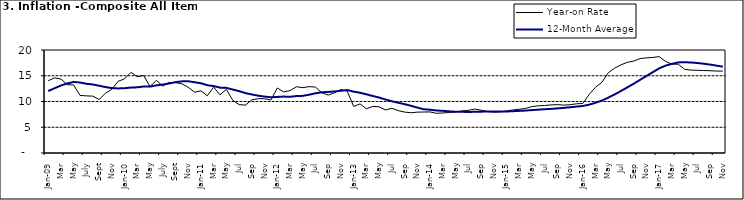
| Category | Year-on Rate | 12-Month Average |
|---|---|---|
| Jan-09 | 14.034 | 12.032 |
| Feb | 14.584 | 12.567 |
| Mar | 14.366 | 13.101 |
| Apr | 13.268 | 13.51 |
| May | 13.212 | 13.787 |
| June | 11.194 | 13.694 |
| July | 11.09 | 13.437 |
| Aug | 11.046 | 13.307 |
| Sept | 10.39 | 13.065 |
| Oct | 11.588 | 12.803 |
| Nov | 12.368 | 12.609 |
| Dec | 13.93 | 12.538 |
| Jan-10 | 14.398 | 12.586 |
| Feb | 15.649 | 12.7 |
| Mar | 14.812 | 12.757 |
| Apr | 15.044 | 12.915 |
| May | 12.915 | 12.893 |
| June | 14.099 | 13.132 |
| July | 13.002 | 13.284 |
| Aug | 13.702 | 13.5 |
| Sept | 13.65 | 13.764 |
| Oct | 13.45 | 13.908 |
| Nov | 12.766 | 13.928 |
| Dec | 11.815 | 13.74 |
| Jan-11 | 12.08 | 13.542 |
| Feb | 11.1 | 13.161 |
| Mar | 12.779 | 13.001 |
| Apr | 11.291 | 12.694 |
| May | 12.352 | 12.648 |
| Jun | 10.23 | 12.321 |
| Jul | 9.397 | 12.009 |
| Aug | 9.301 | 11.635 |
| Sep | 10.339 | 11.363 |
| Oct | 10.544 | 11.13 |
| Nov | 10.54 | 10.952 |
| Dec | 10.283 | 10.826 |
| Jan-12 | 12.626 | 10.886 |
| Feb | 11.866 | 10.955 |
| Mar | 12.111 | 10.914 |
| Apr | 12.866 | 11.054 |
| May | 12.688 | 11.096 |
| Jun | 12.892 | 11.32 |
| Jul | 12.797 | 11.599 |
| Aug | 11.689 | 11.791 |
| Sep | 11.253 | 11.859 |
| Oct | 11.693 | 11.948 |
| Nov | 12.32 | 12.091 |
| Dec | 11.981 | 12.224 |
| Jan-13 | 9.031 | 11.908 |
| Feb | 9.542 | 11.703 |
| Mar | 8.593 | 11.394 |
| Apr | 9.052 | 11.072 |
| May | 8.964 | 10.761 |
| Jun | 8.353 | 10.383 |
| Jul | 8.682 | 10.047 |
| Aug | 8.231 | 9.761 |
| Sep | 7.952 | 9.486 |
| Oct | 7.807 | 9.167 |
| Nov | 7.931 | 8.815 |
| Dec | 7.957 | 8.496 |
| Jan-14 | 7.977 | 8.408 |
| Feb | 7.707 | 8.257 |
| Mar | 7.783 | 8.19 |
| Apr | 7.851 | 8.092 |
| May | 7.965 | 8.012 |
| Jun | 8.167 | 7.998 |
| Jul | 8.281 | 7.968 |
| Aug | 8.534 | 7.996 |
| Sep | 8.317 | 8.027 |
| Oct | 8.06 | 8.047 |
| Nov | 7.927 | 8.046 |
| Dec | 7.978 | 8.047 |
| Jan-15 | 8.157 | 8.063 |
| Feb | 8.359 | 8.117 |
| Mar | 8.494 | 8.176 |
| Apr | 8.655 | 8.243 |
| May | 9.003 | 8.331 |
| Jun | 9.168 | 8.417 |
| Jul | 9.218 | 8.497 |
| Aug | 9.336 | 8.566 |
| Sep | 9.394 | 8.658 |
| Oct | 9.296 | 8.76 |
| Nov | 9.368 | 8.879 |
| Dec | 9.554 | 9.009 |
| Jan-16 | 9.617 | 9.13 |
| Feb | 11.379 | 9.386 |
| Mar | 12.775 | 9.751 |
| Apr | 13.721 | 10.182 |
| May | 15.577 | 10.746 |
| Jun | 16.48 | 11.372 |
| Jul | 17.127 | 12.045 |
| Aug | 17.609 | 12.744 |
| Sep | 17.852 | 13.454 |
| Oct | 18.33 | 14.206 |
| Nov | 18.476 | 14.958 |
| Dec | 18.547 | 15.697 |
| Jan-17 | 18.719 | 16.441 |
| Feb | 17.78 | 16.958 |
| Mar | 17.256 | 17.315 |
| Apr | 17.244 | 17.591 |
| May | 16.251 | 17.628 |
| Jun | 16.098 | 17.578 |
| Jul | 16.053 | 17.475 |
| Aug | 16.012 | 17.331 |
| Sep | 15.979 | 17.17 |
| Oct | 15.905 | 16.968 |
| Nov | 15.901 | 16.76 |